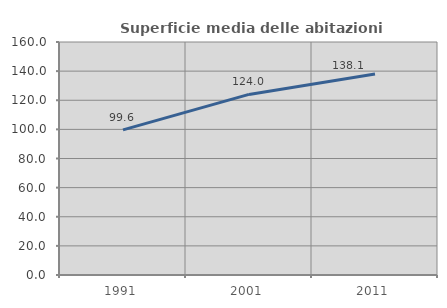
| Category | Superficie media delle abitazioni occupate |
|---|---|
| 1991.0 | 99.625 |
| 2001.0 | 124.011 |
| 2011.0 | 138.079 |